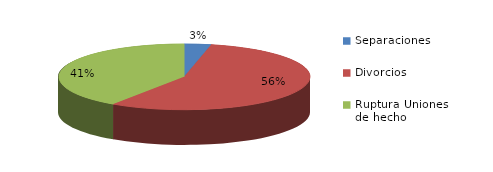
| Category | Series 0 |
|---|---|
| Separaciones | 41 |
| Divorcios | 668 |
| Ruptura Uniones de hecho | 483 |